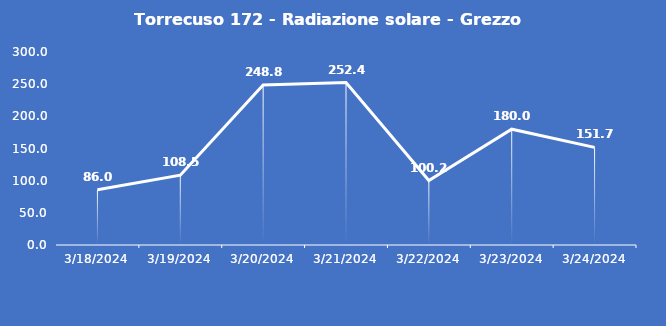
| Category | Torrecuso 172 - Radiazione solare - Grezzo (W/m2) |
|---|---|
| 3/18/24 | 86 |
| 3/19/24 | 108.5 |
| 3/20/24 | 248.8 |
| 3/21/24 | 252.4 |
| 3/22/24 | 100.2 |
| 3/23/24 | 180 |
| 3/24/24 | 151.7 |